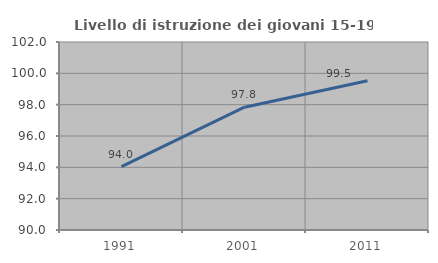
| Category | Livello di istruzione dei giovani 15-19 anni |
|---|---|
| 1991.0 | 94.043 |
| 2001.0 | 97.838 |
| 2011.0 | 99.528 |